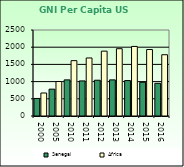
| Category | Senegal | Africa                        |
|---|---|---|
| 2000.0 | 510 | 668.557 |
| 2005.0 | 780 | 1002.896 |
| 2010.0 | 1050 | 1608.999 |
| 2011.0 | 1020 | 1686.521 |
| 2012.0 | 1040 | 1885.129 |
| 2013.0 | 1050 | 1956.671 |
| 2014.0 | 1030 | 2022.289 |
| 2015.0 | 980 | 1932.283 |
| 2016.0 | 950 | 1781.415 |